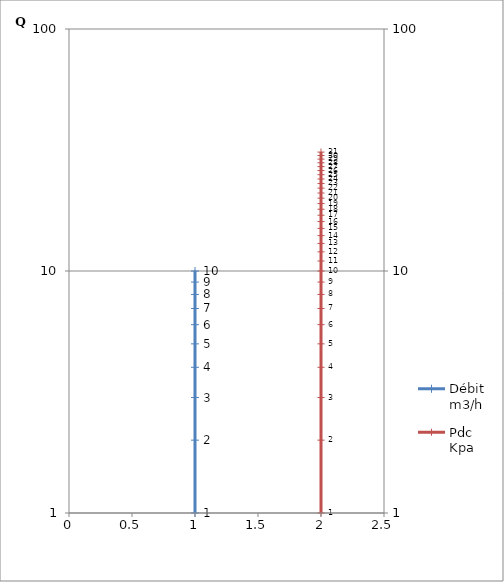
| Category | Débit m3/h |
|---|---|
| 1.0 | 1 |
| 1.0 | 2 |
| 1.0 | 3 |
| 1.0 | 4 |
| 1.0 | 5 |
| 1.0 | 6 |
| 1.0 | 7 |
| 1.0 | 8 |
| 1.0 | 9 |
| 1.0 | 10 |